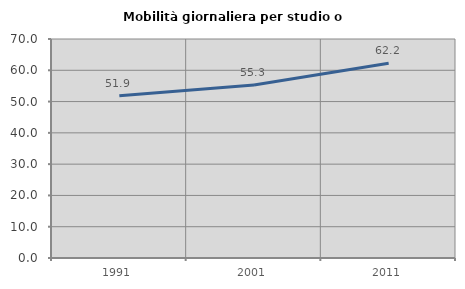
| Category | Mobilità giornaliera per studio o lavoro |
|---|---|
| 1991.0 | 51.85 |
| 2001.0 | 55.271 |
| 2011.0 | 62.234 |